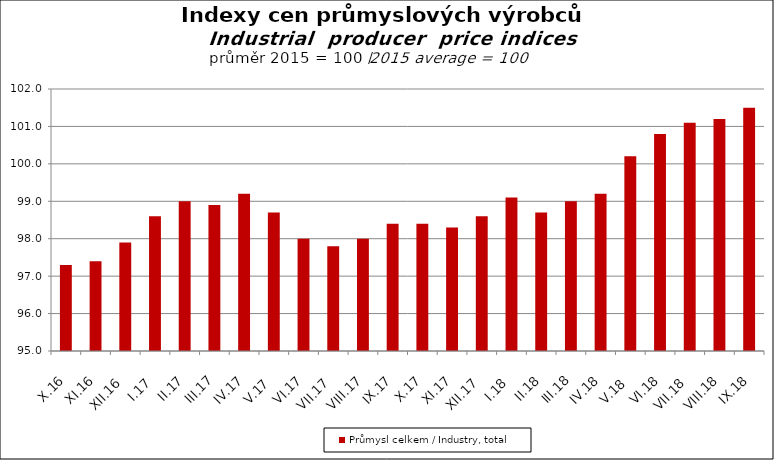
| Category | Průmysl celkem / Industry, total |
|---|---|
| X.16 | 97.3 |
| XI.16 | 97.4 |
| XII.16 | 97.9 |
| I.17 | 98.6 |
| II.17 | 99 |
| III.17 | 98.9 |
| IV.17 | 99.2 |
| V.17 | 98.7 |
| VI.17 | 98 |
| VII.17 | 97.8 |
| VIII.17 | 98 |
| IX.17 | 98.4 |
| X.17 | 98.4 |
| XI.17 | 98.3 |
| XII.17 | 98.6 |
| I.18 | 99.1 |
| II.18 | 98.7 |
| III.18 | 99 |
| IV.18 | 99.2 |
| V.18 | 100.2 |
| VI.18 | 100.8 |
| VII.18 | 101.1 |
| VIII.18 | 101.2 |
| IX.18 | 101.5 |